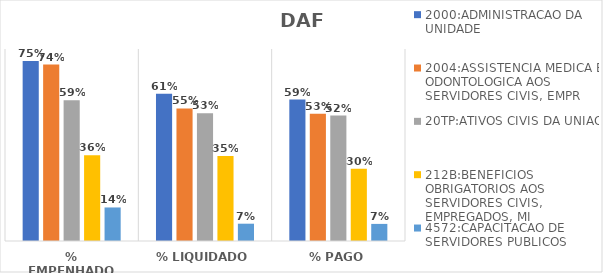
| Category | 2000:ADMINISTRACAO DA UNIDADE | 2004:ASSISTENCIA MEDICA E ODONTOLOGICA AOS SERVIDORES CIVIS, EMPR | 20TP:ATIVOS CIVIS DA UNIAO | 212B:BENEFICIOS OBRIGATORIOS AOS SERVIDORES CIVIS, EMPREGADOS, MI | 4572:CAPACITACAO DE SERVIDORES PUBLICOS FEDERAIS EM PROCESSO DE Q |
|---|---|---|---|---|---|
| % EMPENHADO | 0.75 | 0.735 | 0.587 | 0.358 | 0.14 |
| % LIQUIDADO | 0.614 | 0.552 | 0.532 | 0.354 | 0.072 |
| % PAGO | 0.589 | 0.53 | 0.522 | 0.301 | 0.071 |